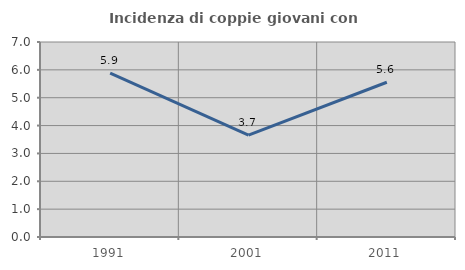
| Category | Incidenza di coppie giovani con figli |
|---|---|
| 1991.0 | 5.882 |
| 2001.0 | 3.659 |
| 2011.0 | 5.556 |